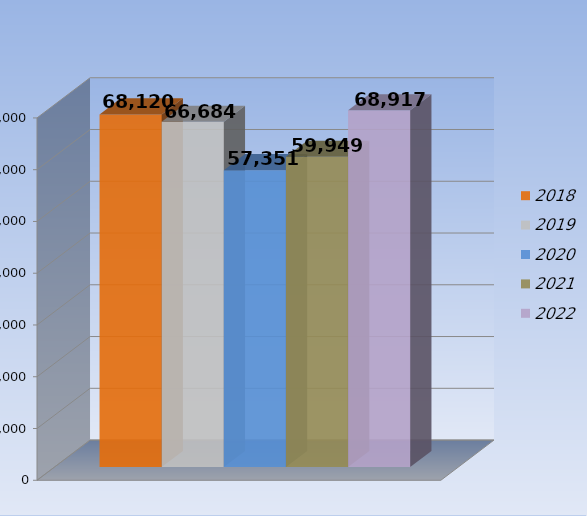
| Category | 2018 | 2019 | 2020 | 2021 | 2022 |
|---|---|---|---|---|---|
| 0 | 68120 | 66684 | 57351 | 59949 | 68917 |